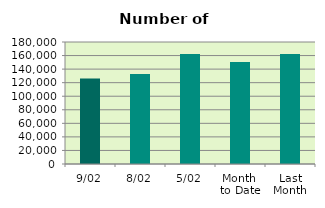
| Category | Series 0 |
|---|---|
| 9/02 | 126120 |
| 8/02 | 132934 |
| 5/02 | 162344 |
| Month 
to Date | 150592 |
| Last
Month | 162275.9 |